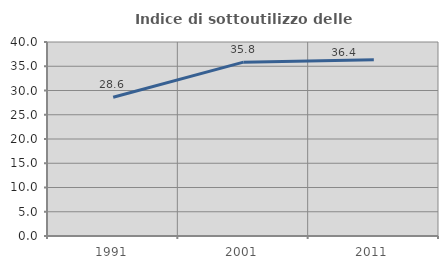
| Category | Indice di sottoutilizzo delle abitazioni  |
|---|---|
| 1991.0 | 28.612 |
| 2001.0 | 35.843 |
| 2011.0 | 36.351 |